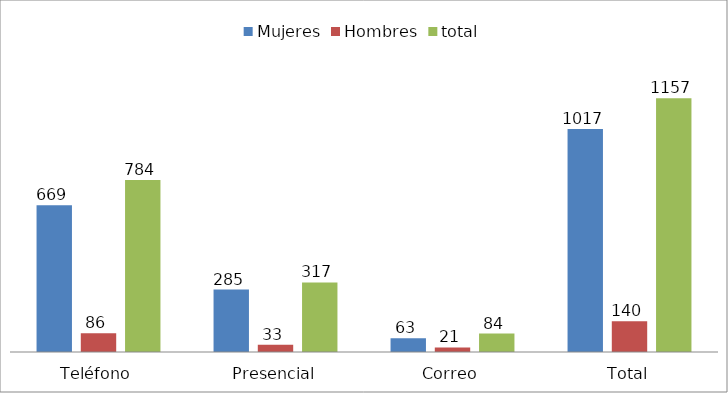
| Category | Mujeres | Hombres | total |
|---|---|---|---|
| Teléfono | 669 | 86 | 784 |
| Presencial | 285 | 33 | 317 |
| Correo | 63 | 21 | 84 |
| Total | 1017 | 140 | 1157 |